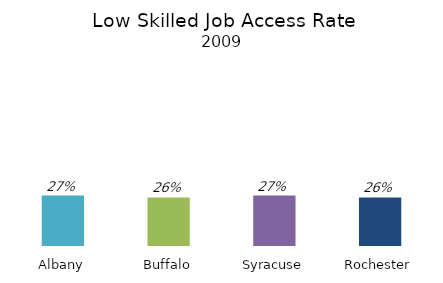
| Category | Series 0 |
|---|---|
| Albany | 0.27 |
| Buffalo | 0.26 |
| Syracuse | 0.27 |
| Rochester | 0.26 |